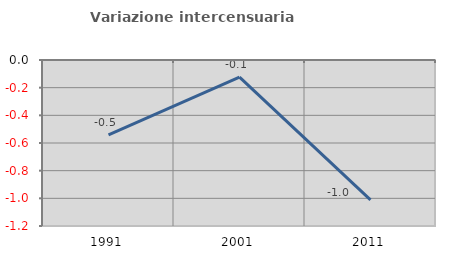
| Category | Variazione intercensuaria annua |
|---|---|
| 1991.0 | -0.542 |
| 2001.0 | -0.124 |
| 2011.0 | -1.011 |